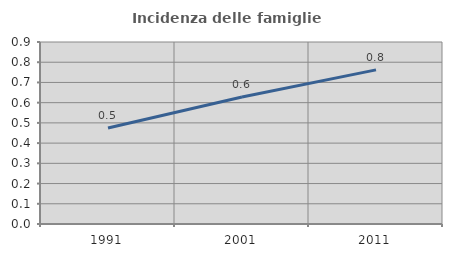
| Category | Incidenza delle famiglie numerose |
|---|---|
| 1991.0 | 0.475 |
| 2001.0 | 0.628 |
| 2011.0 | 0.762 |